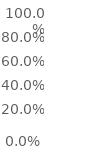
| Category | 1. GESTIÓN INTEGRAL DE ESPECTRO PARA EL INCREMENTO DEL
BIENESTAR SOCIAL del PND |
|---|---|
| Avance | 0 |